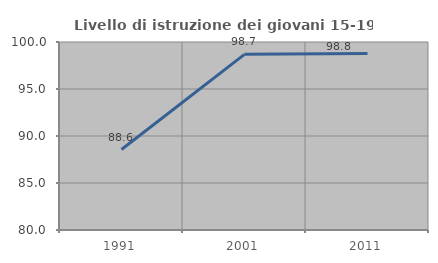
| Category | Livello di istruzione dei giovani 15-19 anni |
|---|---|
| 1991.0 | 88.561 |
| 2001.0 | 98.684 |
| 2011.0 | 98.78 |